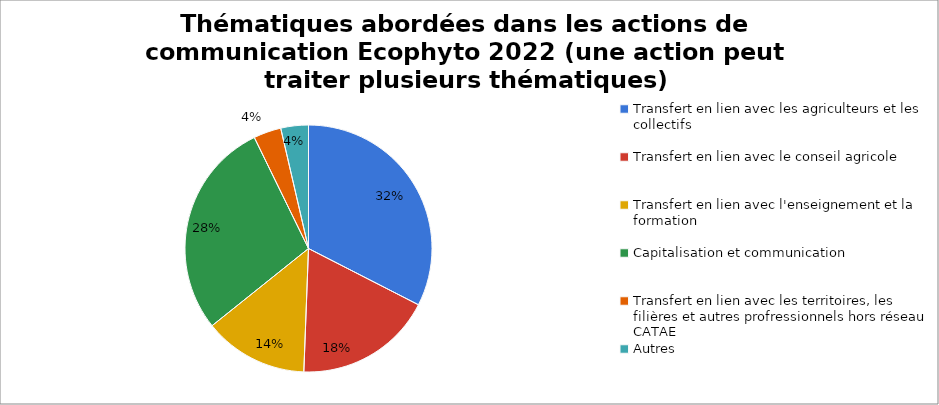
| Category | Thématiques abordées dans les actions de communication Ecophyto 2022 (une action peut traiter plusieurs thématiques) |
|---|---|
| Transfert en lien avec les agriculteurs et les collectifs | 81 |
| Transfert en lien avec le conseil agricole | 45 |
| Transfert en lien avec l'enseignement et la formation | 34 |
| Capitalisation et communication | 71 |
| Transfert en lien avec les territoires, les filières et autres profressionnels hors réseau CATAE | 9 |
| Autres | 9 |